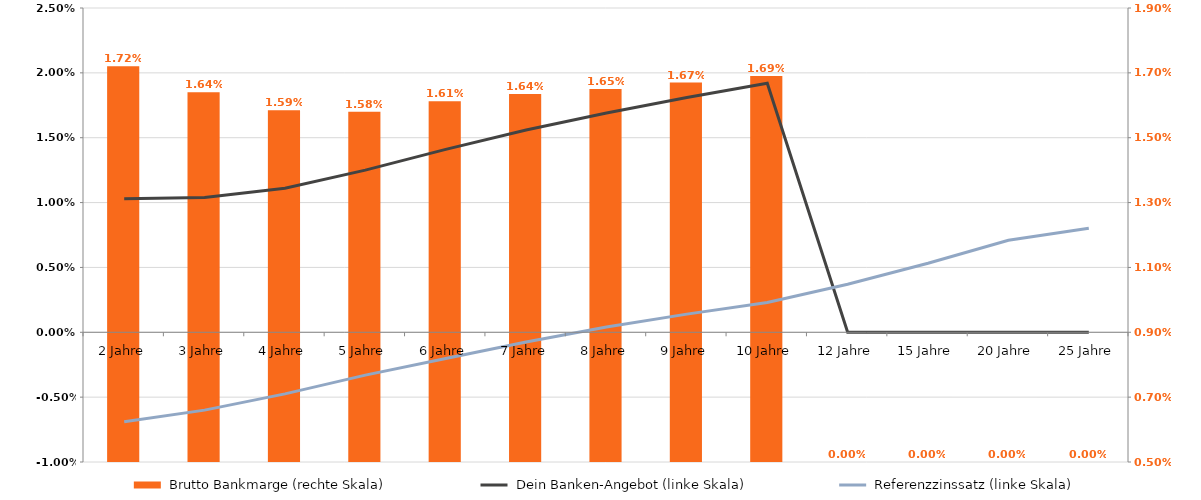
| Category |  Brutto Bankmarge (rechte Skala) |
|---|---|
| 2 Jahre | 0.017 |
| 3 Jahre | 0.016 |
| 4 Jahre | 0.016 |
| 5 Jahre | 0.016 |
| 6 Jahre | 0.016 |
| 7 Jahre | 0.016 |
| 8 Jahre | 0.016 |
| 9 Jahre | 0.017 |
| 10 Jahre | 0.017 |
|  12 Jahre  | 0 |
|  15 Jahre  | 0 |
|  20 Jahre  | 0 |
|  25 Jahre  | 0 |